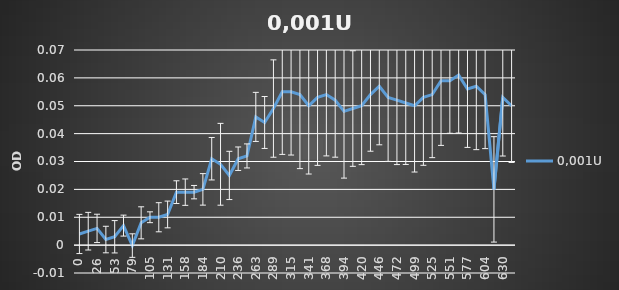
| Category | 0,001U |
|---|---|
| 0.0 | 0.004 |
| 13.0 | 0.005 |
| 26.0 | 0.006 |
| 39.0 | 0.002 |
| 53.0 | 0.003 |
| 66.0 | 0.007 |
| 79.0 | 0 |
| 92.0 | 0.008 |
| 105.0 | 0.01 |
| 118.0 | 0.01 |
| 131.0 | 0.011 |
| 144.0 | 0.019 |
| 158.0 | 0.019 |
| 171.0 | 0.019 |
| 184.0 | 0.02 |
| 197.0 | 0.031 |
| 210.0 | 0.029 |
| 223.0 | 0.025 |
| 236.0 | 0.031 |
| 249.0 | 0.032 |
| 263.0 | 0.046 |
| 276.0 | 0.044 |
| 289.0 | 0.049 |
| 302.0 | 0.055 |
| 315.0 | 0.055 |
| 328.0 | 0.054 |
| 341.0 | 0.05 |
| 354.0 | 0.053 |
| 368.0 | 0.054 |
| 381.0 | 0.052 |
| 394.0 | 0.048 |
| 407.0 | 0.049 |
| 420.0 | 0.05 |
| 433.0 | 0.054 |
| 446.0 | 0.057 |
| 459.0 | 0.053 |
| 472.0 | 0.052 |
| 486.0 | 0.051 |
| 499.0 | 0.05 |
| 512.0 | 0.053 |
| 525.0 | 0.054 |
| 538.0 | 0.059 |
| 551.0 | 0.059 |
| 564.0 | 0.061 |
| 577.0 | 0.056 |
| 591.0 | 0.057 |
| 604.0 | 0.054 |
| 617.0 | 0.02 |
| 630.0 | 0.053 |
| 643.0 | 0.05 |